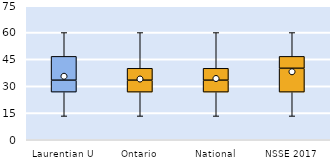
| Category | 25th | 50th | 75th |
|---|---|---|---|
| Laurentian U | 26.667 | 6.667 | 13.333 |
| Ontario | 26.667 | 6.667 | 6.667 |
| National | 26.667 | 6.667 | 6.667 |
| NSSE 2017 | 26.667 | 13.333 | 6.667 |